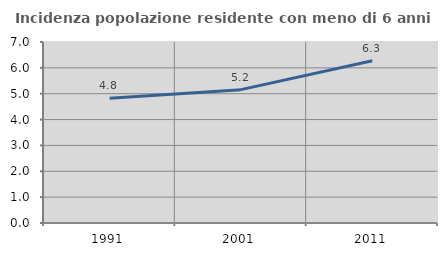
| Category | Incidenza popolazione residente con meno di 6 anni |
|---|---|
| 1991.0 | 4.822 |
| 2001.0 | 5.157 |
| 2011.0 | 6.274 |